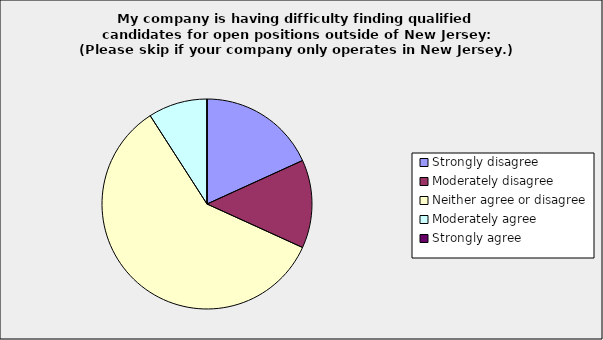
| Category | Series 0 |
|---|---|
| Strongly disagree | 0.182 |
| Moderately disagree | 0.136 |
| Neither agree or disagree | 0.591 |
| Moderately agree | 0.091 |
| Strongly agree | 0 |